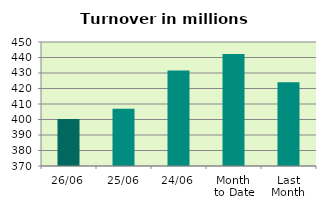
| Category | Series 0 |
|---|---|
| 26/06 | 400.357 |
| 25/06 | 406.93 |
| 24/06 | 431.632 |
| Month 
to Date | 442.217 |
| Last
Month | 424.091 |